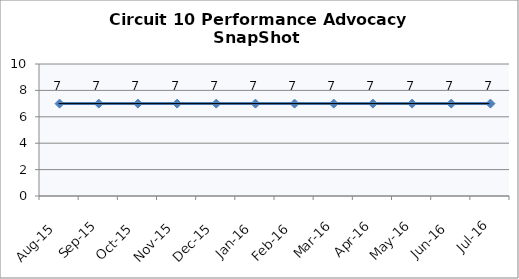
| Category | Circuit 10 |
|---|---|
| Aug-15 | 7 |
| Sep-15 | 7 |
| Oct-15 | 7 |
| Nov-15 | 7 |
| Dec-15 | 7 |
| Jan-16 | 7 |
| Feb-16 | 7 |
| Mar-16 | 7 |
| Apr-16 | 7 |
| May-16 | 7 |
| Jun-16 | 7 |
| Jul-16 | 7 |